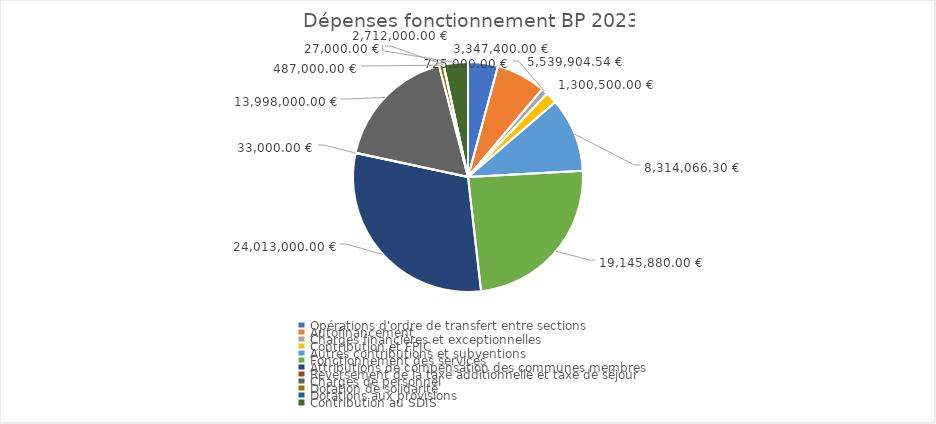
| Category | Series 0 | Series 1 |
|---|---|---|
| Opérations d'ordre de transfert entre sections | 3347400 | 0.042 |
| Autofinancement | 5539904.54 | 0.07 |
| Charges financières et exceptionnelles | 725000 | 0.009 |
| Contribution et FPIC | 1300500 | 0.016 |
| Autres contributions et subventions | 8314066.3 | 0.104 |
| Fonctionnement des services | 19145880 | 0.24 |
| Attributions de compensation des communes membres | 24013000 | 0.302 |
| Reversement de la taxe additionnelle et taxe de séjour | 33000 | 0 |
| Charges de personnel | 13998000 | 0.176 |
| Dotation de solidarité | 487000 | 0.006 |
| Dotations aux provisions | 27000 | 0 |
| Contribution au SDIS | 2712000 | 0.034 |